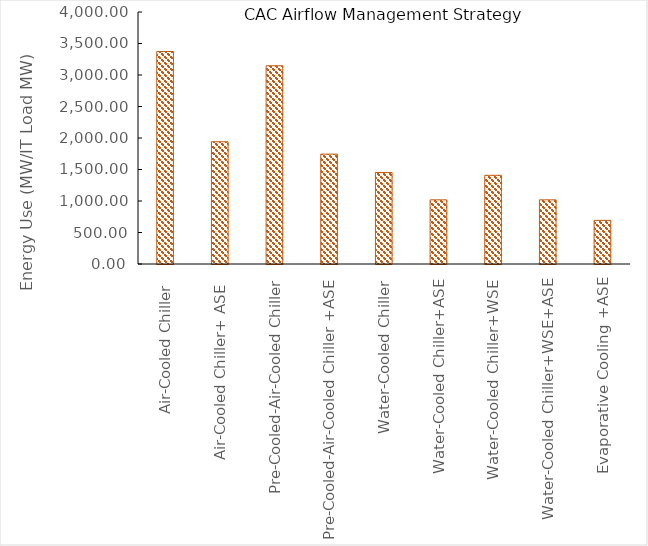
| Category | Series 0 |
|---|---|
| Air-Cooled Chiller  | 3372.82 |
| Air-Cooled Chiller+ ASE  | 1940 |
| Pre-Cooled-Air-Cooled Chiller | 3146.89 |
| Pre-Cooled-Air-Cooled Chiller +ASE | 1744.252 |
| Water-Cooled Chiller | 1452.67 |
| Water-Cooled Chiller+ASE | 1018.31 |
| Water-Cooled Chiller+WSE | 1407.98 |
| Water-Cooled Chiller+WSE+ASE | 1018.31 |
| Evaporative Cooling +ASE | 692.653 |